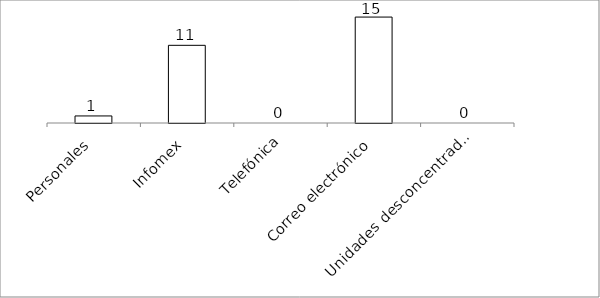
| Category | Series 0 |
|---|---|
| Personales | 1 |
| Infomex | 11 |
| Telefónica | 0 |
| Correo electrónico | 15 |
| Unidades desconcentradas | 0 |